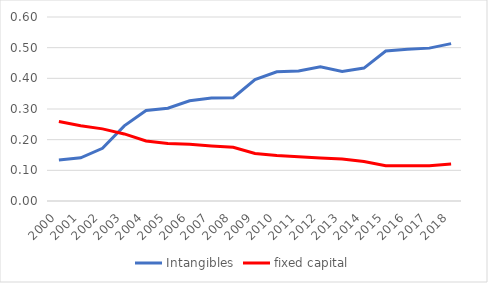
| Category | Intangibles | fixed capital |
|---|---|---|
| 2000.0 | 0.133 | 0.259 |
| 2001.0 | 0.141 | 0.245 |
| 2002.0 | 0.172 | 0.235 |
| 2003.0 | 0.245 | 0.219 |
| 2004.0 | 0.295 | 0.196 |
| 2005.0 | 0.303 | 0.187 |
| 2006.0 | 0.327 | 0.185 |
| 2007.0 | 0.336 | 0.18 |
| 2008.0 | 0.337 | 0.175 |
| 2009.0 | 0.396 | 0.155 |
| 2010.0 | 0.421 | 0.148 |
| 2011.0 | 0.424 | 0.144 |
| 2012.0 | 0.438 | 0.14 |
| 2013.0 | 0.422 | 0.137 |
| 2014.0 | 0.433 | 0.129 |
| 2015.0 | 0.489 | 0.115 |
| 2016.0 | 0.495 | 0.115 |
| 2017.0 | 0.498 | 0.115 |
| 2018.0 | 0.513 | 0.121 |